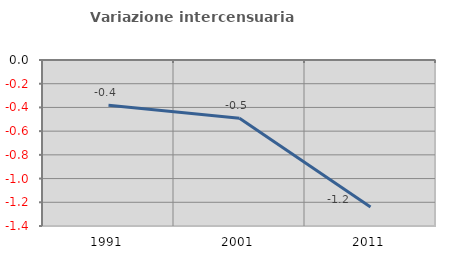
| Category | Variazione intercensuaria annua |
|---|---|
| 1991.0 | -0.381 |
| 2001.0 | -0.491 |
| 2011.0 | -1.239 |